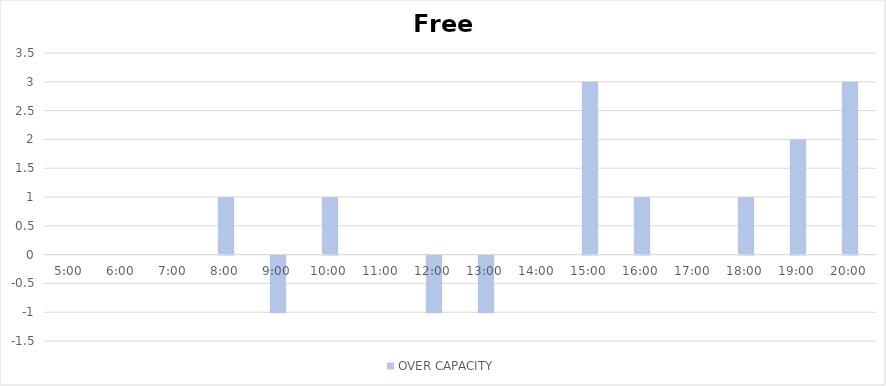
| Category | OVER CAPACITY |
|---|---|
| 0.20833333333333334 | 0 |
| 0.25 | 0 |
| 0.2916666666666667 | 0 |
| 0.3333333333333333 | 1 |
| 0.375 | -1 |
| 0.4166666666666667 | 1 |
| 0.4583333333333333 | 0 |
| 0.5 | -1 |
| 0.5416666666666666 | -1 |
| 0.5833333333333334 | 0 |
| 0.625 | 3 |
| 0.6666666666666666 | 1 |
| 0.7083333333333334 | 0 |
| 0.75 | 1 |
| 0.7916666666666666 | 2 |
| 0.8333333333333334 | 3 |